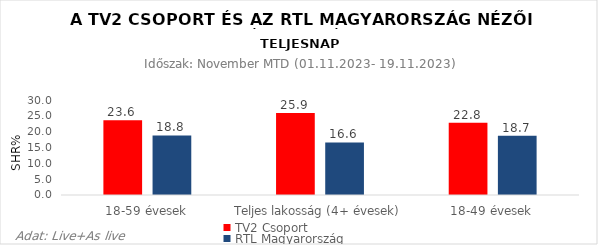
| Category | TV2 Csoport | RTL Magyarország |
|---|---|---|
| 18-59 évesek | 23.6 | 18.8 |
| Teljes lakosság (4+ évesek) | 25.9 | 16.6 |
| 18-49 évesek | 22.8 | 18.7 |